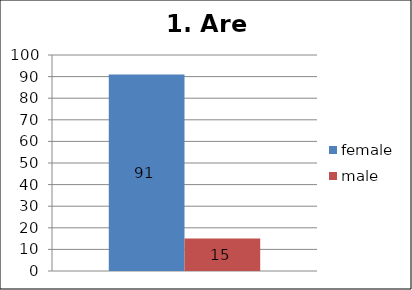
| Category | female | male |
|---|---|---|
| 0 | 91 | 15 |